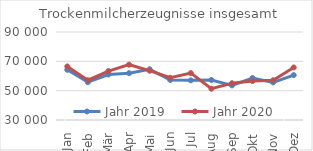
| Category | Jahr 2019 | Jahr 2020 |
|---|---|---|
| Jan | 64232.927 | 66517.93 |
| Feb | 55770.16 | 57107.7 |
| Mär | 61020.036 | 63383.104 |
| Apr | 61941.111 | 67731.248 |
| Mai | 64590.355 | 63611.706 |
| Jun | 57305.322 | 58794.607 |
| Jul | 57034.588 | 61986.397 |
| Aug | 57256.64 | 51335.714 |
| Sep | 53604.034 | 55063.107 |
| Okt | 58608.365 | 56565.297 |
| Nov | 55642.38 | 57094.195 |
| Dez | 60606.448 | 65822.742 |